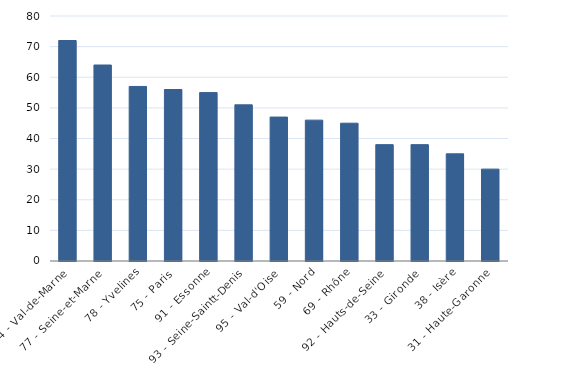
| Category | N |
|---|---|
| 94 - Val-de-Marne | 72 |
| 77 - Seine-et-Marne | 64 |
| 78 - Yvelines | 57 |
| 75 - Paris  | 56 |
| 91 - Essonne | 55 |
| 93 - Seine-Saintt-Denis | 51 |
| 95 - Val-d'Oise | 47 |
| 59 - Nord | 46 |
| 69 - Rhône | 45 |
| 92 - Hauts-de-Seine | 38 |
| 33 - Gironde | 38 |
| 38 - Isère | 35 |
| 31 - Haute-Garonne | 30 |